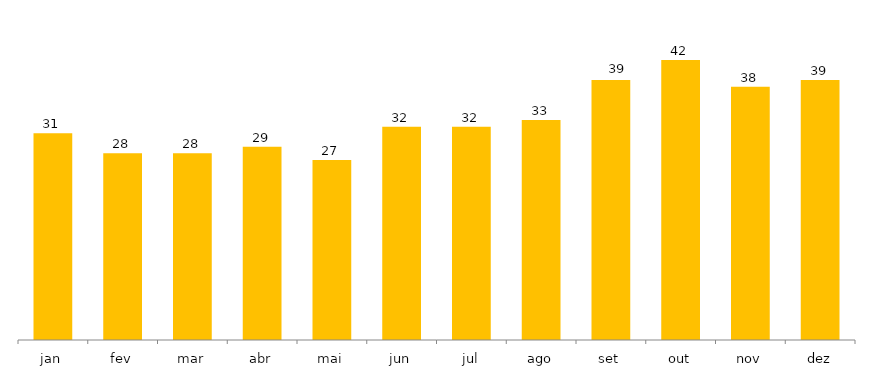
| Category | 2022 |
|---|---|
| jan | 31 |
| fev | 28 |
| mar | 28 |
| abr | 29 |
| mai | 27 |
| jun | 32 |
| jul | 32 |
| ago | 33 |
| set | 39 |
| out | 42 |
| nov | 38 |
| dez | 39 |